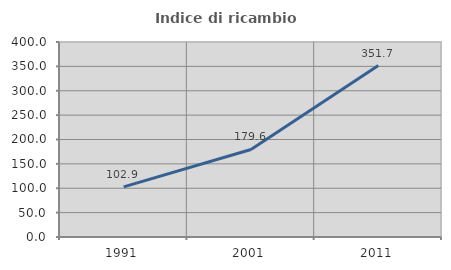
| Category | Indice di ricambio occupazionale  |
|---|---|
| 1991.0 | 102.885 |
| 2001.0 | 179.612 |
| 2011.0 | 351.685 |